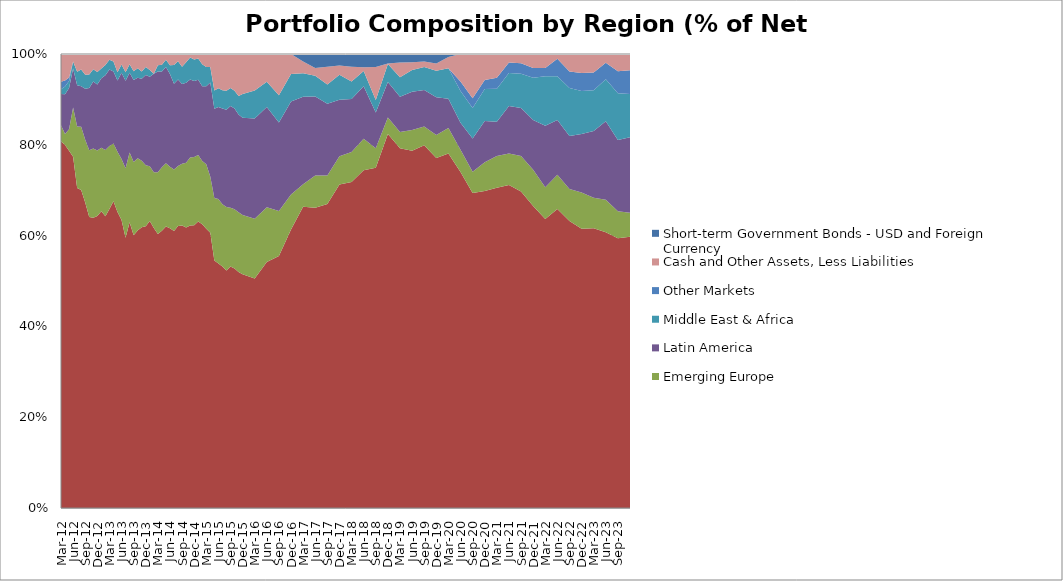
| Category | East & South Asia | Emerging Europe | Latin America | Middle East & Africa | Other Markets | Cash and Other Assets, Less Liabilities | Short-term Government Bonds - USD and Foreign Currency |
|---|---|---|---|---|---|---|---|
| 2012-03-31 | 80.77 | 3.528 | 6.873 | 1.06 | 1.648 | 6.123 | 0 |
| 2012-04-30 | 79.96 | 2.38 | 8.78 | 1.72 | 1.3 | 5.84 | 0 |
| 2012-05-31 | 78.7 | 4.75 | 9.06 | 1.55 | 0.79 | 5.15 | 0 |
| 2012-06-30 | 77.37 | 10.85 | 8.59 | 1.54 | 0 | 1.65 | 0 |
| 2012-07-31 | 70.49 | 13.53 | 9.1 | 2.99 | 0 | 3.89 | 0 |
| 2012-08-31 | 70.07 | 13.89 | 8.94 | 3.71 | 0 | 3.39 | 0 |
| 2012-09-30 | 67.3 | 13.81 | 11.25 | 3.09 | 0 | 4.55 | 0 |
| 2012-10-31 | 64.07 | 14.75 | 13.68 | 2.99 | 0 | 4.51 | 0 |
| 2012-11-30 | 63.92 | 15.26 | 14.78 | 2.68 | 0 | 3.36 | 0 |
| 2012-12-31 | 64.31 | 14.43 | 14.56 | 2.74 | 0 | 3.96 | 0 |
| 2013-01-31 | 65.39 | 13.95 | 15.3 | 2.18 | 0 | 3.18 | 0 |
| 2013-02-28 | 64.28 | 14.55 | 16.48 | 2.27 | 0 | 2.42 | 0 |
| 2013-03-31 | 65.88 | 13.88 | 16.85 | 2.12 | 0 | 1.27 | 0 |
| 2013-04-30 | 67.54 | 12.77 | 15.82 | 2.2 | 0 | 1.67 | 0 |
| 2013-05-31 | 65.18 | 13.3 | 15.66 | 1.85 | 0 | 4.01 | 0 |
| 2013-06-30 | 63.45 | 13.44 | 19 | 1.8 | 0 | 2.31 | 0 |
| 2013-07-31 | 59.54 | 15.28 | 19.29 | 1.87 | 0 | 4.02 | 0 |
| 2013-08-31 | 62.92 | 15.4 | 17.53 | 1.91 | 0 | 2.24 | 0 |
| 2013-09-30 | 60.07 | 16.12 | 18.1 | 1.91 | 0 | 3.8 | 0 |
| 2013-10-31 | 61.13 | 15.89 | 17.75 | 2.1 | 0 | 3.12 | 0 |
| 2013-11-30 | 61.84 | 14.63 | 18.08 | 1.59 | 0 | 3.86 | 0 |
| 2013-12-31 | 62.08 | 13.42 | 19.9 | 1.74 | 0 | 2.86 | 0 |
| 2014-01-31 | 63.22 | 12.03 | 19.72 | 1.5 | 0 | 3.53 | 0 |
| 2014-02-28 | 61.64 | 12.28 | 21.72 | 0 | 0 | 4.33 | 0 |
| 2014-03-31 | 60.362 | 13.606 | 22.203 | 1.326 | 0 | 2.503 | 0 |
| 2014-04-30 | 61.07 | 14 | 21.07 | 1.51 | 0 | 2.35 | 0 |
| 2014-05-31 | 62.01 | 13.94 | 21.19 | 1.61 | 0 | 1.25 | 0 |
| 2014-06-30 | 61.61 | 13.58 | 20.41 | 1.94 | 0 | 2.46 | 0 |
| 2014-07-31 | 61.04 | 13.53 | 18.86 | 4.13 | 0 | 2.44 | 0 |
| 2014-08-31 | 62.11 | 13.22 | 19.04 | 4.01 | 0 | 1.614 | 0 |
| 2014-09-30 | 62.23 | 13.58 | 17.56 | 3.84 | 0 | 2.79 | 0 |
| 2014-10-31 | 61.77 | 14.3 | 17.62 | 4.49 | 0 | 1.82 | 0 |
| 2014-11-30 | 62.21 | 14.99 | 17.19 | 4.85 | 0 | 0.76 | 0 |
| 2014-12-31 | 62.29 | 15.05 | 16.74 | 4.72 | 0 | 1.2 | 0 |
| 2015-01-31 | 63.12 | 14.62 | 16.58 | 4.7 | 0 | 0.98 | 0 |
| 2015-02-28 | 62.5 | 13.93 | 16.48 | 4.84 | 0 | 2.25 | 0 |
| 2015-03-31 | 61.5 | 14.2 | 17.22 | 4.23 | 0 | 2.85 | 0 |
| 2015-04-30 | 60.64 | 12.34 | 20.73 | 3.45 | 0 | 2.84 | 0 |
| 2015-05-31 | 54.53 | 13.76 | 19.64 | 4.02 | 0 | 8.05 | 0 |
| 2015-06-30 | 53.86 | 14.2 | 20.29 | 4.11 | 0 | 7.54 | 0 |
| 2015-07-31 | 53.17 | 13.75 | 21.08 | 4.02 | 0 | 7.98 | 0 |
| 2015-08-31 | 52.33 | 13.98 | 21.39 | 4.18 | 0 | 8.12 | 0 |
| 2015-09-30 | 53.2 | 12.93 | 22.4 | 3.97 | 0 | 7.5 | 0 |
| 2015-10-31 | 52.77 | 13.05 | 22.2 | 3.9 | 0 | 8.08 | 0 |
| 2015-11-30 | 52 | 13.15 | 21.52 | 4.09 | 0 | 9.24 | 0 |
| 2015-12-31 | 51.5 | 13.02 | 21.45 | 5.22 | 0 | 8.81 | 0 |
| 2016-03-31 | 50.54 | 13.19 | 22.09 | 6.14 | 0 | 8.04 | 0 |
| 2016-06-30 | 54.17 | 12.06 | 22.09 | 5.59 | 0 | 6.09 | 0 |
| 2016-09-30 | 55.53 | 9.87 | 19.53 | 5.96 | 0 | 9.11 | 0 |
| 2016-12-31 | 61.32 | 7.72 | 20.51 | 6.02 | 0 | 4.43 | 0 |
| 2017-03-31 | 66.38 | 4.91 | 19.27 | 5.19 | 0 | 2.59 | 1.66 |
| 2017-06-30 | 66.16 | 7.07 | 17.43 | 4.53 | 0 | 1.72 | 3.09 |
| 2017-09-30 | 66.98 | 6.25 | 15.83 | 4.2 | 0 | 3.93 | 2.81 |
| 2017-12-31 | 71.25 | 6.24 | 12.45 | 5.51 | 0 | 2.01 | 2.54 |
| 2018-03-31 | 71.8 | 6.6 | 11.67 | 3.85 | 0 | 3.26 | 2.82 |
| 2018-06-30 | 74.39 | 6.93 | 11.56 | 3.36 | 0 | 0.83 | 2.93 |
| 2018-09-30 | 74.94 | 4.29 | 7.91 | 2.71 | 0 | 7.29 | 2.86 |
| 2018-12-31 | 82.38 | 3.66 | 7.8 | 3.97 | 0 | 0.12 | 2.07 |
| 2019-03-31 | 79.25 | 3.55 | 7.76 | 4.32 | 0 | 3.24 | 1.88 |
| 2019-06-30 | 78.68 | 4.58 | 8.4 | 4.79 | 0 | 1.71 | 1.84 |
| 2019-09-30 | 79.9 | 4.13 | 8.05 | 5.04 | 0 | 1.24 | 1.64 |
| 2019-12-31 | 77.08 | 5.06 | 8.31 | 5.86 | 0 | 1.62 | 2.07 |
| 2020-03-31 | 78.09 | 5.63 | 6.43 | 6.69 | 0 | 2.52 | 0.64 |
| 2020-06-30 | 73.99 | 4.93 | 5.92 | 6.99 | 2.1 | 6.07 | 0 |
| 2020-09-30 | 69.39 | 4.67 | 7.34 | 6.69 | 2.18 | 9.73 | 0 |
| 2020-12-31 | 69.81 | 6.35 | 9.08 | 7.06 | 2 | 5.7 | 0 |
| 2021-03-31 | 70.55 | 6.96 | 7.54 | 7.3 | 2.44 | 5.21 | 0 |
| 2021-06-30 | 71.15 | 6.95 | 10.44 | 7.26 | 2.34 | 1.86 | 0 |
| 2021-09-30 | 69.73 | 7.81 | 10.54 | 7.57 | 2.3 | 2.05 | 0 |
| 2021-12-31 | 66.54 | 7.99 | 10.95 | 9.29 | 2.17 | 3.06 | 0 |
| 2022-03-31 | 63.64 | 7.03 | 13.54 | 10.89 | 1.79 | 3.11 | 0 |
| 2022-06-30 | 65.88 | 7.52 | 12.08 | 9.64 | 3.84 | 1.04 | 0 |
| 2022-09-30 | 63.23 | 7.05 | 11.68 | 10.53 | 3.64 | 3.87 | 0 |
| 2022-12-31 | 61.5 | 7.97 | 12.92 | 9.46 | 3.94 | 4.21 | 0 |
| 2023-03-31 | 61.64 | 6.72 | 14.68 | 8.98 | 3.9 | 4.08 | 0 |
| 2023-06-30 | 60.74 | 7.16 | 17.3 | 9.25 | 3.61 | 1.94 | 0 |
| 2023-09-30 | 59.41 | 5.97 | 15.7 | 10.27 | 4.84 | 3.81 | 0 |
| 2023-12-31 | 59.77 | 5.28 | 16.59 | 9.53 | 5.25 | 3.58 | 0 |